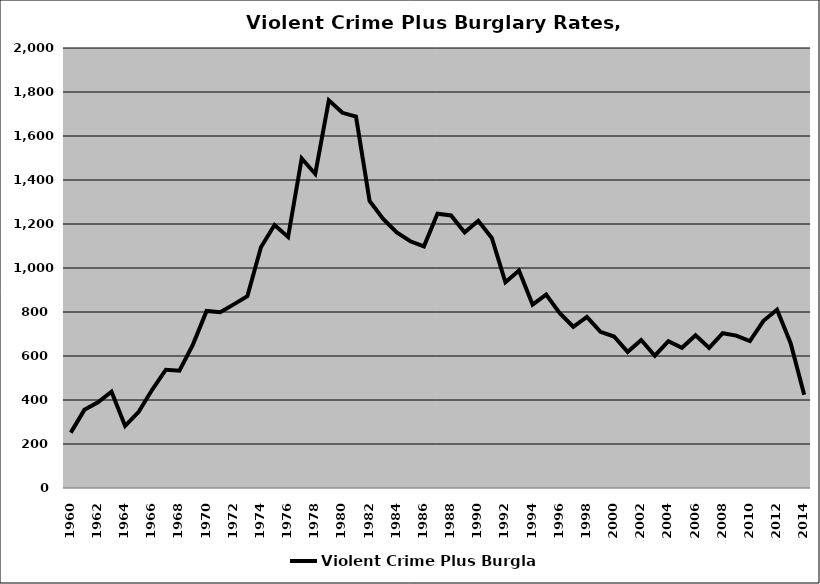
| Category | Violent Crime Plus Burglary |
|---|---|
| 1960.0 | 251.615 |
| 1961.0 | 355.19 |
| 1962.0 | 389.231 |
| 1963.0 | 437.436 |
| 1964.0 | 281.907 |
| 1965.0 | 346.348 |
| 1966.0 | 447.654 |
| 1967.0 | 537.65 |
| 1968.0 | 533.175 |
| 1969.0 | 652.847 |
| 1970.0 | 804.529 |
| 1971.0 | 798.69 |
| 1972.0 | 834.632 |
| 1973.0 | 871.983 |
| 1974.0 | 1094.468 |
| 1975.0 | 1195.117 |
| 1976.0 | 1140.966 |
| 1977.0 | 1497.723 |
| 1978.0 | 1427.515 |
| 1979.0 | 1762.069 |
| 1980.0 | 1705.46 |
| 1981.0 | 1687.767 |
| 1982.0 | 1305.233 |
| 1983.0 | 1222.857 |
| 1984.0 | 1161.509 |
| 1985.0 | 1121.495 |
| 1986.0 | 1098.336 |
| 1987.0 | 1246.898 |
| 1988.0 | 1239.029 |
| 1989.0 | 1161.905 |
| 1990.0 | 1214.554 |
| 1991.0 | 1136.861 |
| 1992.0 | 935.088 |
| 1993.0 | 988.542 |
| 1994.0 | 833.793 |
| 1995.0 | 879.145 |
| 1996.0 | 794.228 |
| 1997.0 | 732.767 |
| 1998.0 | 777.327 |
| 1999.0 | 709.57 |
| 2000.0 | 688.537 |
| 2001.0 | 618.946 |
| 2002.0 | 672.769 |
| 2003.0 | 601.282 |
| 2004.0 | 667.704 |
| 2005.0 | 637.385 |
| 2006.0 | 694.173 |
| 2007.0 | 636.938 |
| 2008.0 | 703.487 |
| 2009.0 | 692.872 |
| 2010.0 | 668.168 |
| 2011.0 | 760.144 |
| 2012.0 | 809.965 |
| 2013.0 | 658.366 |
| 2014.0 | 423.901 |